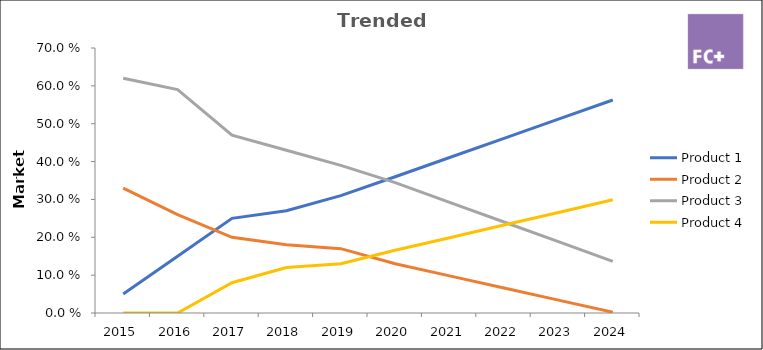
| Category | Product 1 | Product 2 | Product 3 | Product 4 |
|---|---|---|---|---|
| 2015.0 | 0.05 | 0.33 | 0.62 | 0 |
| 2016.0 | 0.15 | 0.26 | 0.59 | 0 |
| 2017.0 | 0.25 | 0.2 | 0.47 | 0.08 |
| 2018.0 | 0.27 | 0.18 | 0.43 | 0.12 |
| 2019.0 | 0.31 | 0.17 | 0.39 | 0.13 |
| 2020.0 | 0.36 | 0.13 | 0.344 | 0.166 |
| 2021.0 | 0.411 | 0.098 | 0.292 | 0.199 |
| 2022.0 | 0.461 | 0.066 | 0.24 | 0.232 |
| 2023.0 | 0.512 | 0.034 | 0.188 | 0.266 |
| 2024.0 | 0.563 | 0.002 | 0.136 | 0.299 |